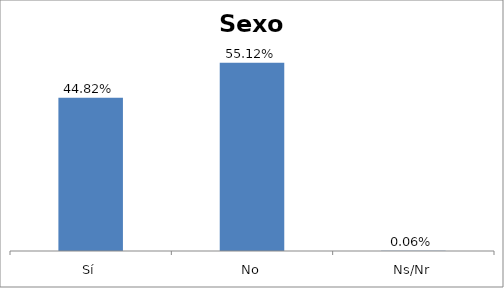
| Category | Total |
|---|---|
| Sí | 0.448 |
| No | 0.551 |
| Ns/Nr | 0.001 |